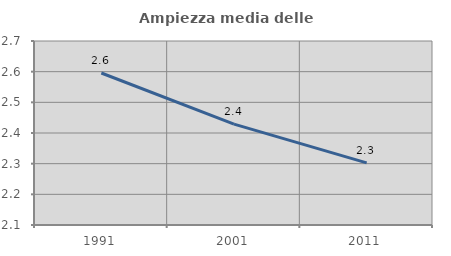
| Category | Ampiezza media delle famiglie |
|---|---|
| 1991.0 | 2.596 |
| 2001.0 | 2.429 |
| 2011.0 | 2.303 |